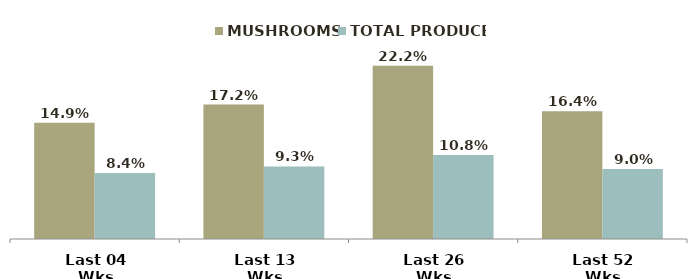
| Category | MUSHROOMS | TOTAL PRODUCE |
|---|---|---|
| Last 04 Wks | 0.149 | 0.084 |
| Last 13 Wks | 0.172 | 0.093 |
| Last 26 Wks | 0.222 | 0.108 |
| Last 52 Wks | 0.164 | 0.09 |